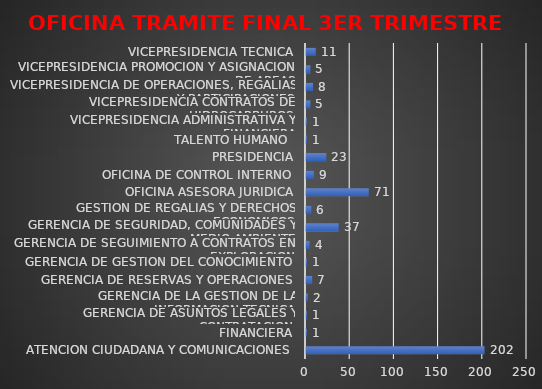
| Category | Series 0 |
|---|---|
| ATENCION CIUDADANA Y COMUNICACIONES | 202 |
| FINANCIERA | 1 |
| GERENCIA DE ASUNTOS LEGALES Y CONTRATACION | 1 |
| GERENCIA DE LA GESTION DE LA INFORMACION TECNICA | 2 |
| GERENCIA DE RESERVAS Y OPERACIONES | 7 |
| GERENCIA DE GESTION DEL CONOCIMIENTO | 1 |
| GERENCIA DE SEGUIMIENTO A CONTRATOS EN EXPLORACION | 4 |
| GERENCIA DE SEGURIDAD, COMUNIDADES Y MEDIO AMBIENTE | 37 |
| GESTION DE REGALIAS Y DERECHOS ECONOMICOS | 6 |
| OFICINA ASESORA JURIDICA | 71 |
| OFICINA DE CONTROL INTERNO | 9 |
| PRESIDENCIA | 23 |
| TALENTO HUMANO  | 1 |
| VICEPRESIDENCIA ADMINISTRATIVA Y FINANCIERA | 1 |
| VICEPRESIDENCIA CONTRATOS DE HIDROCARBUROS | 5 |
| VICEPRESIDENCIA DE OPERACIONES, REGALIAS Y PARTICIPACIONES | 8 |
| VICEPRESIDENCIA PROMOCION Y ASIGNACION DE AREAS | 5 |
| VICEPRESIDENCIA TECNICA | 11 |